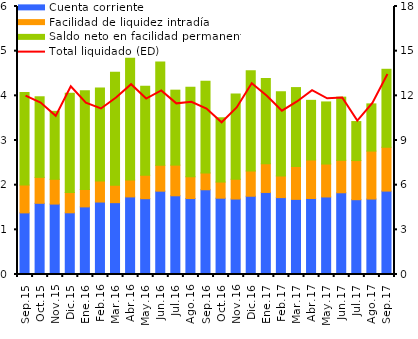
| Category | Cuenta corriente | Facilidad de liquidez intradía | Saldo neto en facilidad permanente |
|---|---|---|---|
| Sep.15 | 1.379 | 0.622 | 2.071 |
| Oct.15 | 1.594 | 0.581 | 1.804 |
| Nov.15 | 1.577 | 0.555 | 1.521 |
| Dic.15 | 1.381 | 0.454 | 2.223 |
| Ene.16 | 1.514 | 0.39 | 2.208 |
| Feb.16 | 1.622 | 0.473 | 2.078 |
| Mar.16 | 1.609 | 0.39 | 2.528 |
| Abr.16 | 1.737 | 0.378 | 2.725 |
| May.16 | 1.697 | 0.523 | 1.994 |
| Jun.16 | 1.865 | 0.579 | 2.315 |
| Jul.16 | 1.762 | 0.686 | 1.678 |
| Ago.16 | 1.7 | 0.487 | 2.003 |
| Sep.16 | 1.897 | 0.376 | 2.052 |
| Oct.16 | 1.708 | 0.362 | 1.439 |
| Nov.16 | 1.69 | 0.442 | 1.911 |
| Dic.16 | 1.752 | 0.568 | 2.242 |
| Ene.17 | 1.836 | 0.64 | 1.913 |
| Feb.17 | 1.721 | 0.486 | 1.882 |
| Mar.17 | 1.682 | 0.736 | 1.767 |
| Abr.17 | 1.702 | 0.862 | 1.335 |
| May.17 | 1.736 | 0.737 | 1.39 |
| Jun.17 | 1.83 | 0.726 | 1.415 |
| Jul.17 | 1.675 | 0.876 | 0.873 |
| Ago.17 | 1.69 | 1.074 | 1.057 |
| Sep.17 | 1.867 | 0.982 | 1.745 |